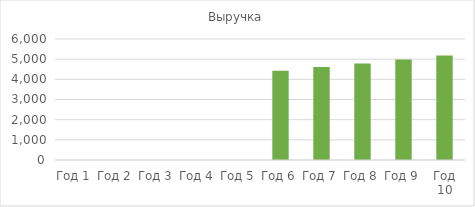
| Category | Выручка |
|---|---|
| Год 1 | 0 |
| Год 2 | 0 |
| Год 3 | 0 |
| Год 4 | 0 |
| Год 5 | 0 |
| Год 6 | 4428.617 |
| Год 7 | 4605.761 |
| Год 8 | 4789.992 |
| Год 9 | 4981.591 |
| Год 10 | 5180.855 |